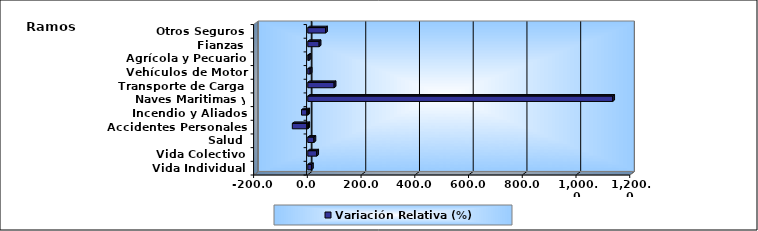
| Category | Variación Relativa (%) |
|---|---|
| Vida Individual | 13.593 |
| Vida Colectivo | 33.127 |
| Salud | 22.86 |
| Accidentes Personales | -57.532 |
| Incendio y Aliados | -23.223 |
| Naves Maritimas y Aéreas | 1134.917 |
| Transporte de Carga | 98.03 |
| Vehículos de Motor | 8.787 |
| Agrícola y Pecuario | 4.38 |
| Fianzas | 42.211 |
| Otros Seguros | 66.058 |